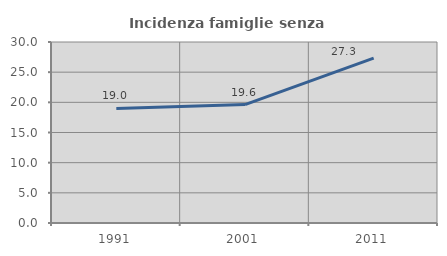
| Category | Incidenza famiglie senza nuclei |
|---|---|
| 1991.0 | 18.993 |
| 2001.0 | 19.633 |
| 2011.0 | 27.327 |